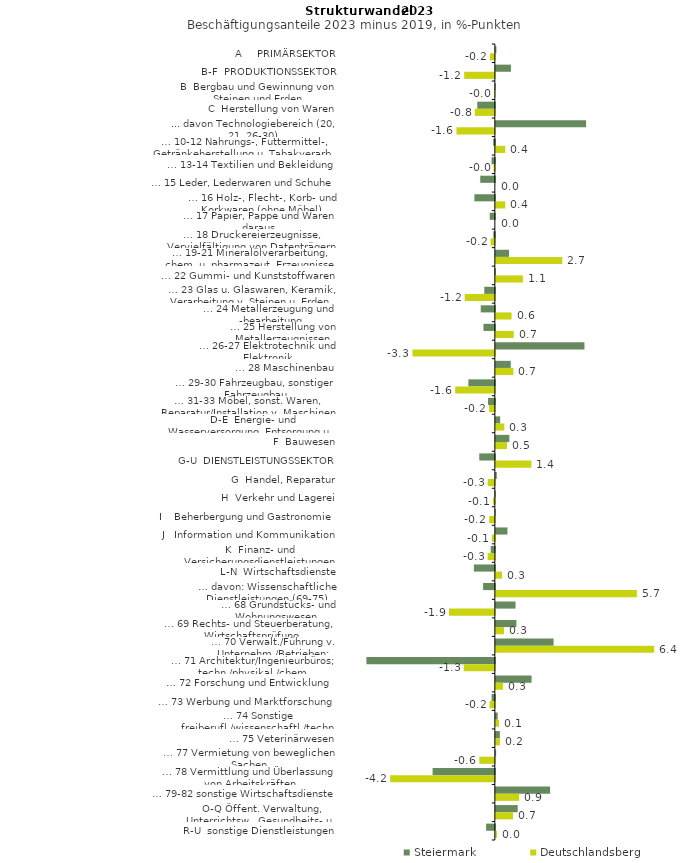
| Category | Steiermark | Deutschlandsberg |
|---|---|---|
| A     PRIMÄRSEKTOR | 0.022 | -0.196 |
| B-F  PRODUKTIONSSEKTOR | 0.612 | -1.246 |
| B  Bergbau und Gewinnung von Steinen und Erden | -0.009 | -0.001 |
| C  Herstellung von Waren | -0.714 | -0.815 |
| ... davon Technologiebereich (20, 21, 26-30) | 3.66 | -1.559 |
| … 10-12 Nahrungs-, Futtermittel-, Getränkeherstellung u. Tabakverarb. | -0.068 | 0.383 |
| … 13-14 Textilien und Bekleidung | -0.134 | -0.049 |
| … 15 Leder, Lederwaren und Schuhe | -0.593 | 0 |
| … 16 Holz-, Flecht-, Korb- und Korkwaren (ohne Möbel)  | -0.83 | 0.383 |
| … 17 Papier, Pappe und Waren daraus  | -0.208 | 0 |
| … 18 Druckereierzeugnisse, Vervielfältigung von Datenträgern | -0.063 | -0.173 |
| … 19-21 Mineralölverarbeitung, chem. u. pharmazeut. Erzeugnisse | 0.535 | 2.697 |
| … 22 Gummi- und Kunststoffwaren | -0.02 | 1.098 |
| … 23 Glas u. Glaswaren, Keramik, Verarbeitung v. Steinen u. Erden  | -0.429 | -1.224 |
| … 24 Metallerzeugung und -bearbeitung | -0.572 | 0.638 |
| … 25 Herstellung von Metallerzeugnissen  | -0.464 | 0.724 |
| … 26-27 Elektrotechnik und Elektronik | 3.595 | -3.345 |
| … 28 Maschinenbau | 0.604 | 0.711 |
| … 29-30 Fahrzeugbau, sonstiger Fahrzeugbau | -1.076 | -1.61 |
| … 31-33 Möbel, sonst. Waren, Reparatur/Installation v. Maschinen | -0.279 | -0.234 |
| D-E  Energie- und Wasserversorgung, Entsorgung u. Rückgewinnung | 0.175 | 0.345 |
| F  Bauwesen | 0.547 | 0.451 |
| G-U  DIENSTLEISTUNGSSEKTOR | -0.633 | 1.441 |
| G  Handel, Reparatur | 0.038 | -0.29 |
| H  Verkehr und Lagerei | -0.011 | -0.072 |
| I    Beherbergung und Gastronomie | -0.007 | -0.23 |
| J   Information und Kommunikation | 0.471 | -0.118 |
| K  Finanz- und Versicherungsdienstleistungen | -0.168 | -0.293 |
| L-N  Wirtschaftsdienste | -0.853 | 0.253 |
| … davon: Wissenschaftliche Dienstleistungen (69-75) | -0.478 | 5.723 |
| … 68 Grundstücks- und Wohnungswesen  | 0.798 | -1.859 |
| … 69 Rechts- und Steuerberatung, Wirtschaftsprüfung | 0.834 | 0.33 |
| … 70 Verwalt./Führung v. Unternehm./Betrieben; Unternehmensberat. | 2.342 | 6.426 |
| … 71 Architektur/Ingenieurbüros; techn./physikal./chem. Untersuchung | -5.212 | -1.261 |
| … 72 Forschung und Entwicklung  | 1.449 | 0.293 |
| … 73 Werbung und Marktforschung | -0.133 | -0.216 |
| … 74 Sonstige freiberufl./wissenschaftl./techn. Tätigkeiten | 0.074 | 0.129 |
| … 75 Veterinärwesen | 0.163 | 0.165 |
| … 77 Vermietung von beweglichen Sachen  | 0.011 | -0.63 |
| … 78 Vermittlung und Überlassung von Arbeitskräften | -2.527 | -4.246 |
| … 79-82 sonstige Wirtschaftsdienste | 2.199 | 0.944 |
| O-Q Öffent. Verwaltung, Unterrichtsw., Gesundheits- u. Sozialwesen | 0.886 | 0.695 |
| R-U  sonstige Dienstleistungen | -0.355 | 0.043 |